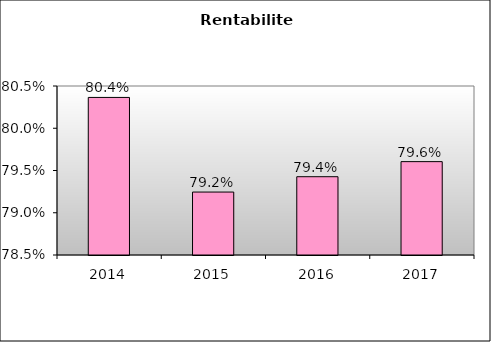
| Category | Series 0 |
|---|---|
| 2014.0 | 0.804 |
| 2015.0 | 0.792 |
| 2016.0 | 0.794 |
| 2017.0 | 0.796 |